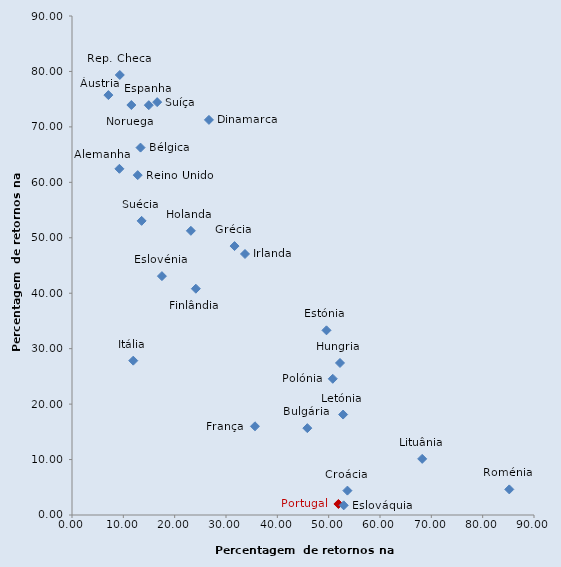
| Category | Retornos na emigração |
|---|---|
| 7.0884840039937895 | 75.734 |
| 13.352861615339858 | 66.264 |
| 45.84449286021565 | 15.664 |
| 53.64901561439239 | 4.398 |
| 9.308605667482066 | 79.362 |
| 26.674614141085733 | 71.263 |
| 49.57263171093603 | 33.308 |
| 24.123082725672617 | 40.814 |
| 35.64326170997033 | 16 |
| 9.232759512193306 | 62.44 |
| 31.663033110778034 | 48.504 |
| 52.206829896907216 | 27.418 |
| 33.70024051440632 | 47.076 |
| 11.934448434073571 | 27.835 |
| 52.81542898341745 | 18.116 |
| 68.21736354931376 | 10.124 |
| 23.155107650022906 | 51.255 |
| 11.560864787304913 | 73.946 |
| 50.80103554251166 | 24.567 |
| 51.897159444329255 | 1.989 |
| 85.18489562973967 | 4.618 |
| 52.928535503634954 | 1.742 |
| 17.51391319738058 | 43.083 |
| 14.962389215759291 | 73.915 |
| 13.561102382882007 | 53.05 |
| 16.587386765671315 | 74.465 |
| 12.800605367001063 | 61.301 |